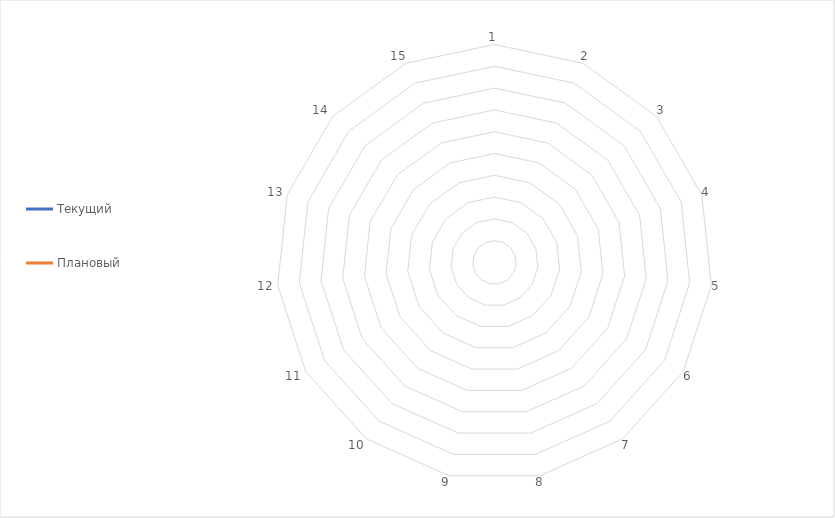
| Category | Текущий | Плановый |
|---|---|---|
| 1.0 | 0 | 0 |
| 2.0 | 0 | 0 |
| 3.0 | 0 | 0 |
| 4.0 | 0 | 0 |
| 5.0 | 0 | 0 |
| 6.0 | 0 | 0 |
| 7.0 | 0 | 0 |
| 8.0 | 0 | 0 |
| 9.0 | 0 | 0 |
| 10.0 | 0 | 0 |
| 11.0 | 0 | 0 |
| 12.0 | 0 | 0 |
| 13.0 | 0 | 0 |
| 14.0 | 0 | 0 |
| 15.0 | 0 | 0 |